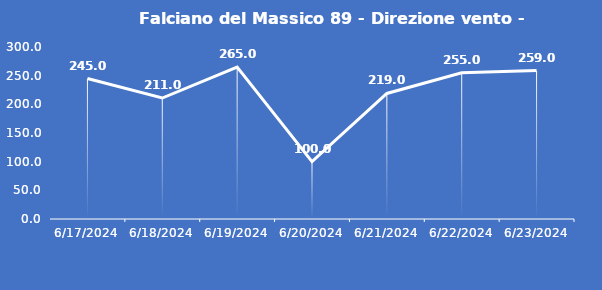
| Category | Falciano del Massico 89 - Direzione vento - Grezzo (°N) |
|---|---|
| 6/17/24 | 245 |
| 6/18/24 | 211 |
| 6/19/24 | 265 |
| 6/20/24 | 100 |
| 6/21/24 | 219 |
| 6/22/24 | 255 |
| 6/23/24 | 259 |